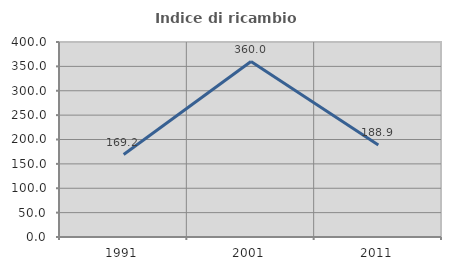
| Category | Indice di ricambio occupazionale  |
|---|---|
| 1991.0 | 169.231 |
| 2001.0 | 360 |
| 2011.0 | 188.889 |